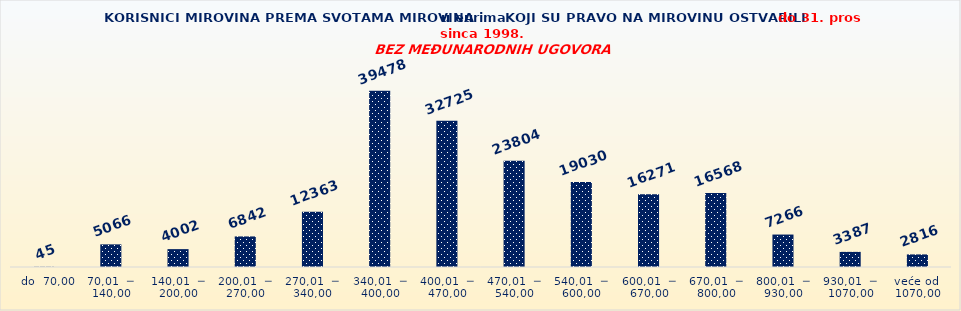
| Category | Series 0 |
|---|---|
|   do  70,00 | 45 |
| 70,01  ─  140,00 | 5066 |
| 140,01  ─  200,00 | 4002 |
| 200,01  ─  270,00 | 6842 |
| 270,01  ─  340,00 | 12363 |
| 340,01  ─  400,00 | 39478 |
| 400,01  ─  470,00 | 32725 |
| 470,01  ─  540,00 | 23804 |
| 540,01  ─  600,00 | 19030 |
| 600,01  ─  670,00 | 16271 |
| 670,01  ─  800,00 | 16568 |
| 800,01  ─  930,00 | 7266 |
| 930,01  ─  1070,00 | 3387 |
| veće od  1070,00 | 2816 |